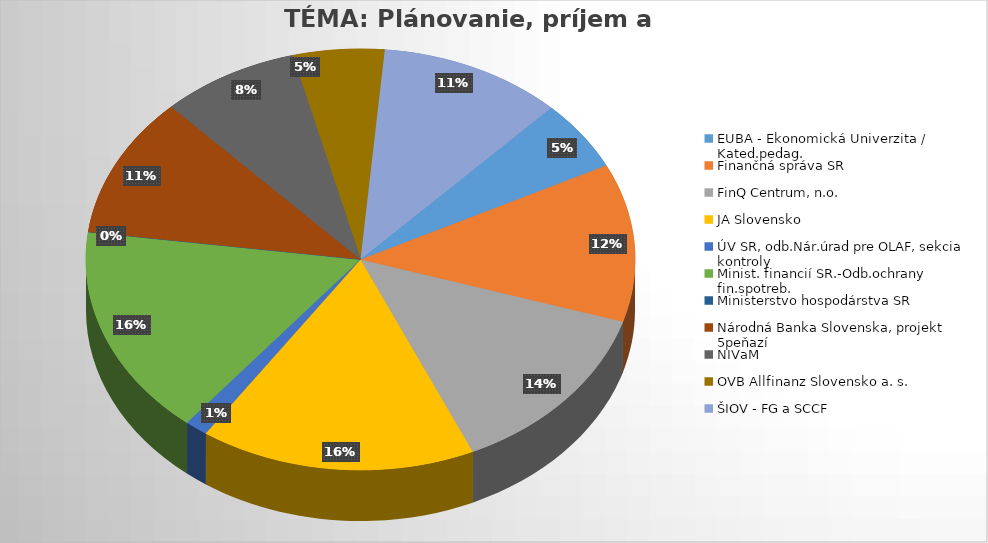
| Category | Series 0 |
|---|---|
| EUBA - Ekonomická Univerzita / Kated.pedag. | 0.333 |
| Finančná správa SR | 0.75 |
| FinQ Centrum, n.o. | 0.833 |
| JA Slovensko | 1 |
| ÚV SR, odb.Nár.úrad pre OLAF, sekcia kontroly | 0.083 |
| Minist. financií SR.-Odb.ochrany fin.spotreb. | 1 |
| Ministerstvo hospodárstva SR | 0 |
| Národná Banka Slovenska, projekt 5peňazí | 0.667 |
| NIVaM | 0.5 |
| OVB Allfinanz Slovensko a. s.  | 0.333 |
| ŠIOV - FG a SCCF | 0.667 |